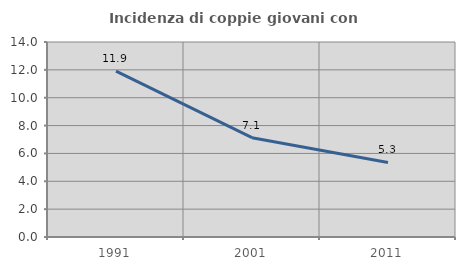
| Category | Incidenza di coppie giovani con figli |
|---|---|
| 1991.0 | 11.904 |
| 2001.0 | 7.129 |
| 2011.0 | 5.35 |